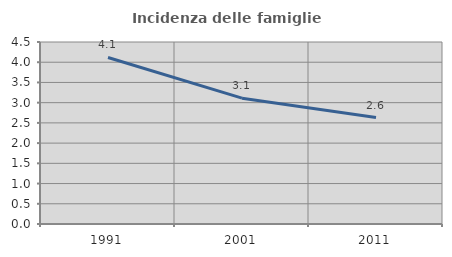
| Category | Incidenza delle famiglie numerose |
|---|---|
| 1991.0 | 4.118 |
| 2001.0 | 3.112 |
| 2011.0 | 2.632 |